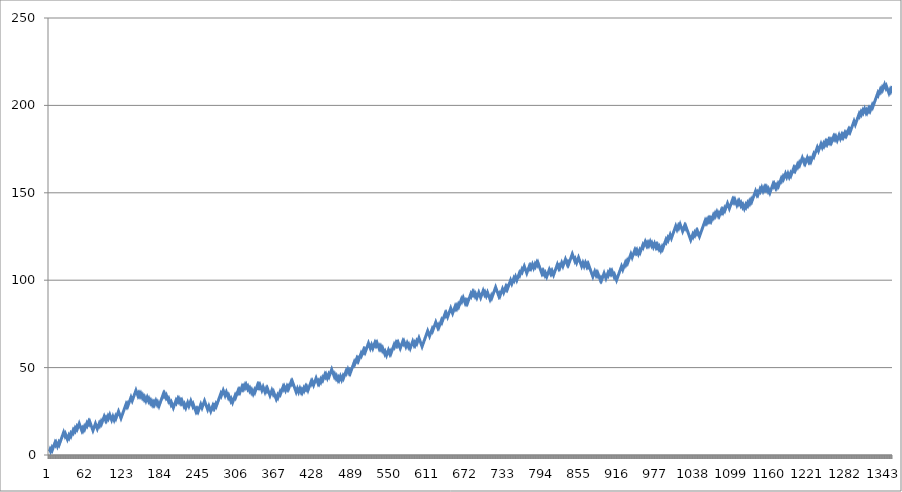
| Category | Series 0 |
|---|---|
| 0 | 2 |
| 1 | 3 |
| 2 | 2 |
| 3 | 3 |
| 4 | 4 |
| 5 | 3 |
| 6 | 4 |
| 7 | 5 |
| 8 | 6 |
| 9 | 7 |
| 10 | 6 |
| 11 | 7 |
| 12 | 6 |
| 13 | 5 |
| 14 | 6 |
| 15 | 7 |
| 16 | 6 |
| 17 | 7 |
| 18 | 8 |
| 19 | 9 |
| 20 | 10 |
| 21 | 11 |
| 22 | 12 |
| 23 | 13 |
| 24 | 12 |
| 25 | 11 |
| 26 | 12 |
| 27 | 11 |
| 28 | 10 |
| 29 | 9 |
| 30 | 10 |
| 31 | 11 |
| 32 | 10 |
| 33 | 11 |
| 34 | 12 |
| 35 | 11 |
| 36 | 12 |
| 37 | 13 |
| 38 | 14 |
| 39 | 13 |
| 40 | 14 |
| 41 | 15 |
| 42 | 14 |
| 43 | 15 |
| 44 | 16 |
| 45 | 15 |
| 46 | 16 |
| 47 | 17 |
| 48 | 18 |
| 49 | 17 |
| 50 | 16 |
| 51 | 15 |
| 52 | 14 |
| 53 | 15 |
| 54 | 14 |
| 55 | 15 |
| 56 | 16 |
| 57 | 15 |
| 58 | 16 |
| 59 | 17 |
| 60 | 18 |
| 61 | 17 |
| 62 | 18 |
| 63 | 19 |
| 64 | 18 |
| 65 | 19 |
| 66 | 18 |
| 67 | 17 |
| 68 | 16 |
| 69 | 15 |
| 70 | 14 |
| 71 | 15 |
| 72 | 16 |
| 73 | 17 |
| 74 | 18 |
| 75 | 17 |
| 76 | 16 |
| 77 | 15 |
| 78 | 16 |
| 79 | 17 |
| 80 | 18 |
| 81 | 17 |
| 82 | 18 |
| 83 | 19 |
| 84 | 18 |
| 85 | 19 |
| 86 | 20 |
| 87 | 21 |
| 88 | 22 |
| 89 | 21 |
| 90 | 20 |
| 91 | 21 |
| 92 | 20 |
| 93 | 21 |
| 94 | 22 |
| 95 | 21 |
| 96 | 22 |
| 97 | 23 |
| 98 | 22 |
| 99 | 21 |
| 100 | 20 |
| 101 | 21 |
| 102 | 22 |
| 103 | 21 |
| 104 | 20 |
| 105 | 21 |
| 106 | 22 |
| 107 | 21 |
| 108 | 22 |
| 109 | 23 |
| 110 | 24 |
| 111 | 25 |
| 112 | 24 |
| 113 | 23 |
| 114 | 22 |
| 115 | 21 |
| 116 | 22 |
| 117 | 23 |
| 118 | 24 |
| 119 | 25 |
| 120 | 26 |
| 121 | 27 |
| 122 | 28 |
| 123 | 29 |
| 124 | 28 |
| 125 | 29 |
| 126 | 28 |
| 127 | 29 |
| 128 | 30 |
| 129 | 31 |
| 130 | 32 |
| 131 | 33 |
| 132 | 32 |
| 133 | 31 |
| 134 | 32 |
| 135 | 33 |
| 136 | 34 |
| 137 | 35 |
| 138 | 36 |
| 139 | 37 |
| 140 | 36 |
| 141 | 35 |
| 142 | 34 |
| 143 | 35 |
| 144 | 34 |
| 145 | 35 |
| 146 | 34 |
| 147 | 35 |
| 148 | 34 |
| 149 | 33 |
| 150 | 34 |
| 151 | 33 |
| 152 | 32 |
| 153 | 33 |
| 154 | 32 |
| 155 | 31 |
| 156 | 32 |
| 157 | 33 |
| 158 | 32 |
| 159 | 31 |
| 160 | 32 |
| 161 | 31 |
| 162 | 30 |
| 163 | 31 |
| 164 | 30 |
| 165 | 29 |
| 166 | 30 |
| 167 | 29 |
| 168 | 30 |
| 169 | 29 |
| 170 | 30 |
| 171 | 31 |
| 172 | 30 |
| 173 | 29 |
| 174 | 30 |
| 175 | 29 |
| 176 | 28 |
| 177 | 29 |
| 178 | 30 |
| 179 | 31 |
| 180 | 32 |
| 181 | 33 |
| 182 | 34 |
| 183 | 35 |
| 184 | 34 |
| 185 | 35 |
| 186 | 34 |
| 187 | 33 |
| 188 | 34 |
| 189 | 33 |
| 190 | 32 |
| 191 | 31 |
| 192 | 32 |
| 193 | 31 |
| 194 | 30 |
| 195 | 29 |
| 196 | 30 |
| 197 | 29 |
| 198 | 28 |
| 199 | 27 |
| 200 | 28 |
| 201 | 29 |
| 202 | 30 |
| 203 | 31 |
| 204 | 30 |
| 205 | 31 |
| 206 | 32 |
| 207 | 31 |
| 208 | 32 |
| 209 | 31 |
| 210 | 30 |
| 211 | 31 |
| 212 | 30 |
| 213 | 31 |
| 214 | 30 |
| 215 | 29 |
| 216 | 28 |
| 217 | 29 |
| 218 | 28 |
| 219 | 27 |
| 220 | 28 |
| 221 | 29 |
| 222 | 30 |
| 223 | 29 |
| 224 | 28 |
| 225 | 29 |
| 226 | 30 |
| 227 | 31 |
| 228 | 30 |
| 229 | 29 |
| 230 | 28 |
| 231 | 29 |
| 232 | 28 |
| 233 | 27 |
| 234 | 26 |
| 235 | 25 |
| 236 | 26 |
| 237 | 25 |
| 238 | 26 |
| 239 | 25 |
| 240 | 26 |
| 241 | 27 |
| 242 | 28 |
| 243 | 29 |
| 244 | 28 |
| 245 | 27 |
| 246 | 28 |
| 247 | 29 |
| 248 | 30 |
| 249 | 31 |
| 250 | 30 |
| 251 | 29 |
| 252 | 28 |
| 253 | 27 |
| 254 | 26 |
| 255 | 27 |
| 256 | 28 |
| 257 | 27 |
| 258 | 26 |
| 259 | 25 |
| 260 | 26 |
| 261 | 27 |
| 262 | 28 |
| 263 | 27 |
| 264 | 28 |
| 265 | 27 |
| 266 | 28 |
| 267 | 29 |
| 268 | 28 |
| 269 | 29 |
| 270 | 30 |
| 271 | 31 |
| 272 | 32 |
| 273 | 33 |
| 274 | 34 |
| 275 | 35 |
| 276 | 34 |
| 277 | 35 |
| 278 | 36 |
| 279 | 37 |
| 280 | 36 |
| 281 | 35 |
| 282 | 34 |
| 283 | 35 |
| 284 | 36 |
| 285 | 35 |
| 286 | 34 |
| 287 | 33 |
| 288 | 34 |
| 289 | 33 |
| 290 | 32 |
| 291 | 31 |
| 292 | 32 |
| 293 | 31 |
| 294 | 30 |
| 295 | 31 |
| 296 | 32 |
| 297 | 33 |
| 298 | 34 |
| 299 | 33 |
| 300 | 34 |
| 301 | 35 |
| 302 | 36 |
| 303 | 37 |
| 304 | 36 |
| 305 | 37 |
| 306 | 36 |
| 307 | 37 |
| 308 | 38 |
| 309 | 39 |
| 310 | 38 |
| 311 | 39 |
| 312 | 38 |
| 313 | 39 |
| 314 | 40 |
| 315 | 39 |
| 316 | 40 |
| 317 | 39 |
| 318 | 38 |
| 319 | 39 |
| 320 | 38 |
| 321 | 37 |
| 322 | 38 |
| 323 | 37 |
| 324 | 36 |
| 325 | 37 |
| 326 | 36 |
| 327 | 35 |
| 328 | 36 |
| 329 | 37 |
| 330 | 36 |
| 331 | 37 |
| 332 | 38 |
| 333 | 39 |
| 334 | 40 |
| 335 | 39 |
| 336 | 40 |
| 337 | 39 |
| 338 | 40 |
| 339 | 39 |
| 340 | 38 |
| 341 | 37 |
| 342 | 38 |
| 343 | 39 |
| 344 | 38 |
| 345 | 37 |
| 346 | 36 |
| 347 | 37 |
| 348 | 38 |
| 349 | 37 |
| 350 | 38 |
| 351 | 37 |
| 352 | 36 |
| 353 | 35 |
| 354 | 34 |
| 355 | 35 |
| 356 | 36 |
| 357 | 37 |
| 358 | 36 |
| 359 | 35 |
| 360 | 36 |
| 361 | 35 |
| 362 | 34 |
| 363 | 33 |
| 364 | 32 |
| 365 | 33 |
| 366 | 34 |
| 367 | 33 |
| 368 | 34 |
| 369 | 35 |
| 370 | 36 |
| 371 | 35 |
| 372 | 36 |
| 373 | 37 |
| 374 | 38 |
| 375 | 39 |
| 376 | 38 |
| 377 | 39 |
| 378 | 38 |
| 379 | 37 |
| 380 | 38 |
| 381 | 39 |
| 382 | 38 |
| 383 | 39 |
| 384 | 38 |
| 385 | 39 |
| 386 | 40 |
| 387 | 41 |
| 388 | 42 |
| 389 | 41 |
| 390 | 42 |
| 391 | 41 |
| 392 | 40 |
| 393 | 39 |
| 394 | 38 |
| 395 | 37 |
| 396 | 36 |
| 397 | 37 |
| 398 | 38 |
| 399 | 37 |
| 400 | 36 |
| 401 | 37 |
| 402 | 38 |
| 403 | 37 |
| 404 | 36 |
| 405 | 37 |
| 406 | 36 |
| 407 | 37 |
| 408 | 38 |
| 409 | 37 |
| 410 | 38 |
| 411 | 39 |
| 412 | 38 |
| 413 | 39 |
| 414 | 38 |
| 415 | 37 |
| 416 | 38 |
| 417 | 39 |
| 418 | 40 |
| 419 | 41 |
| 420 | 42 |
| 421 | 41 |
| 422 | 42 |
| 423 | 41 |
| 424 | 40 |
| 425 | 41 |
| 426 | 42 |
| 427 | 43 |
| 428 | 44 |
| 429 | 43 |
| 430 | 42 |
| 431 | 41 |
| 432 | 42 |
| 433 | 41 |
| 434 | 42 |
| 435 | 43 |
| 436 | 42 |
| 437 | 43 |
| 438 | 44 |
| 439 | 43 |
| 440 | 44 |
| 441 | 45 |
| 442 | 46 |
| 443 | 45 |
| 444 | 46 |
| 445 | 45 |
| 446 | 44 |
| 447 | 45 |
| 448 | 46 |
| 449 | 45 |
| 450 | 46 |
| 451 | 47 |
| 452 | 48 |
| 453 | 49 |
| 454 | 48 |
| 455 | 47 |
| 456 | 46 |
| 457 | 45 |
| 458 | 46 |
| 459 | 45 |
| 460 | 44 |
| 461 | 45 |
| 462 | 44 |
| 463 | 43 |
| 464 | 44 |
| 465 | 43 |
| 466 | 44 |
| 467 | 45 |
| 468 | 44 |
| 469 | 43 |
| 470 | 44 |
| 471 | 45 |
| 472 | 44 |
| 473 | 45 |
| 474 | 46 |
| 475 | 47 |
| 476 | 48 |
| 477 | 47 |
| 478 | 48 |
| 479 | 49 |
| 480 | 48 |
| 481 | 47 |
| 482 | 48 |
| 483 | 47 |
| 484 | 48 |
| 485 | 49 |
| 486 | 50 |
| 487 | 51 |
| 488 | 52 |
| 489 | 53 |
| 490 | 52 |
| 491 | 53 |
| 492 | 54 |
| 493 | 55 |
| 494 | 54 |
| 495 | 55 |
| 496 | 54 |
| 497 | 55 |
| 498 | 56 |
| 499 | 57 |
| 500 | 58 |
| 501 | 57 |
| 502 | 58 |
| 503 | 59 |
| 504 | 60 |
| 505 | 59 |
| 506 | 60 |
| 507 | 59 |
| 508 | 60 |
| 509 | 61 |
| 510 | 62 |
| 511 | 63 |
| 512 | 64 |
| 513 | 63 |
| 514 | 62 |
| 515 | 61 |
| 516 | 62 |
| 517 | 63 |
| 518 | 62 |
| 519 | 61 |
| 520 | 62 |
| 521 | 63 |
| 522 | 64 |
| 523 | 63 |
| 524 | 64 |
| 525 | 63 |
| 526 | 64 |
| 527 | 63 |
| 528 | 62 |
| 529 | 61 |
| 530 | 62 |
| 531 | 61 |
| 532 | 62 |
| 533 | 61 |
| 534 | 60 |
| 535 | 61 |
| 536 | 60 |
| 537 | 59 |
| 538 | 58 |
| 539 | 59 |
| 540 | 58 |
| 541 | 57 |
| 542 | 58 |
| 543 | 59 |
| 544 | 60 |
| 545 | 59 |
| 546 | 58 |
| 547 | 59 |
| 548 | 58 |
| 549 | 59 |
| 550 | 60 |
| 551 | 61 |
| 552 | 62 |
| 553 | 63 |
| 554 | 62 |
| 555 | 63 |
| 556 | 64 |
| 557 | 63 |
| 558 | 64 |
| 559 | 63 |
| 560 | 64 |
| 561 | 63 |
| 562 | 62 |
| 563 | 61 |
| 564 | 62 |
| 565 | 63 |
| 566 | 64 |
| 567 | 65 |
| 568 | 64 |
| 569 | 65 |
| 570 | 64 |
| 571 | 63 |
| 572 | 62 |
| 573 | 63 |
| 574 | 64 |
| 575 | 63 |
| 576 | 62 |
| 577 | 63 |
| 578 | 62 |
| 579 | 61 |
| 580 | 62 |
| 581 | 63 |
| 582 | 64 |
| 583 | 65 |
| 584 | 64 |
| 585 | 63 |
| 586 | 64 |
| 587 | 63 |
| 588 | 64 |
| 589 | 65 |
| 590 | 64 |
| 591 | 65 |
| 592 | 66 |
| 593 | 67 |
| 594 | 66 |
| 595 | 65 |
| 596 | 64 |
| 597 | 63 |
| 598 | 62 |
| 599 | 63 |
| 600 | 64 |
| 601 | 65 |
| 602 | 66 |
| 603 | 67 |
| 604 | 68 |
| 605 | 69 |
| 606 | 70 |
| 607 | 71 |
| 608 | 70 |
| 609 | 69 |
| 610 | 68 |
| 611 | 69 |
| 612 | 70 |
| 613 | 71 |
| 614 | 72 |
| 615 | 71 |
| 616 | 72 |
| 617 | 73 |
| 618 | 74 |
| 619 | 75 |
| 620 | 76 |
| 621 | 75 |
| 622 | 74 |
| 623 | 73 |
| 624 | 74 |
| 625 | 73 |
| 626 | 74 |
| 627 | 75 |
| 628 | 76 |
| 629 | 77 |
| 630 | 76 |
| 631 | 77 |
| 632 | 78 |
| 633 | 79 |
| 634 | 80 |
| 635 | 81 |
| 636 | 80 |
| 637 | 81 |
| 638 | 80 |
| 639 | 79 |
| 640 | 80 |
| 641 | 81 |
| 642 | 82 |
| 643 | 83 |
| 644 | 84 |
| 645 | 83 |
| 646 | 82 |
| 647 | 81 |
| 648 | 82 |
| 649 | 83 |
| 650 | 84 |
| 651 | 85 |
| 652 | 84 |
| 653 | 85 |
| 654 | 84 |
| 655 | 85 |
| 656 | 86 |
| 657 | 85 |
| 658 | 86 |
| 659 | 87 |
| 660 | 88 |
| 661 | 89 |
| 662 | 88 |
| 663 | 89 |
| 664 | 90 |
| 665 | 89 |
| 666 | 88 |
| 667 | 87 |
| 668 | 88 |
| 669 | 87 |
| 670 | 88 |
| 671 | 87 |
| 672 | 88 |
| 673 | 89 |
| 674 | 90 |
| 675 | 91 |
| 676 | 92 |
| 677 | 91 |
| 678 | 92 |
| 679 | 93 |
| 680 | 92 |
| 681 | 93 |
| 682 | 92 |
| 683 | 91 |
| 684 | 92 |
| 685 | 91 |
| 686 | 90 |
| 687 | 91 |
| 688 | 92 |
| 689 | 93 |
| 690 | 92 |
| 691 | 91 |
| 692 | 90 |
| 693 | 91 |
| 694 | 92 |
| 695 | 93 |
| 696 | 94 |
| 697 | 93 |
| 698 | 92 |
| 699 | 93 |
| 700 | 92 |
| 701 | 91 |
| 702 | 92 |
| 703 | 93 |
| 704 | 92 |
| 705 | 91 |
| 706 | 90 |
| 707 | 89 |
| 708 | 90 |
| 709 | 91 |
| 710 | 90 |
| 711 | 91 |
| 712 | 92 |
| 713 | 93 |
| 714 | 94 |
| 715 | 95 |
| 716 | 96 |
| 717 | 95 |
| 718 | 94 |
| 719 | 93 |
| 720 | 92 |
| 721 | 91 |
| 722 | 92 |
| 723 | 91 |
| 724 | 92 |
| 725 | 93 |
| 726 | 94 |
| 727 | 95 |
| 728 | 94 |
| 729 | 93 |
| 730 | 94 |
| 731 | 95 |
| 732 | 96 |
| 733 | 95 |
| 734 | 96 |
| 735 | 95 |
| 736 | 96 |
| 737 | 97 |
| 738 | 98 |
| 739 | 99 |
| 740 | 100 |
| 741 | 99 |
| 742 | 98 |
| 743 | 99 |
| 744 | 100 |
| 745 | 101 |
| 746 | 100 |
| 747 | 101 |
| 748 | 102 |
| 749 | 101 |
| 750 | 100 |
| 751 | 101 |
| 752 | 102 |
| 753 | 103 |
| 754 | 104 |
| 755 | 103 |
| 756 | 104 |
| 757 | 105 |
| 758 | 106 |
| 759 | 105 |
| 760 | 106 |
| 761 | 107 |
| 762 | 108 |
| 763 | 107 |
| 764 | 106 |
| 765 | 105 |
| 766 | 104 |
| 767 | 105 |
| 768 | 106 |
| 769 | 107 |
| 770 | 108 |
| 771 | 107 |
| 772 | 108 |
| 773 | 107 |
| 774 | 108 |
| 775 | 109 |
| 776 | 108 |
| 777 | 107 |
| 778 | 108 |
| 779 | 109 |
| 780 | 108 |
| 781 | 109 |
| 782 | 110 |
| 783 | 109 |
| 784 | 110 |
| 785 | 109 |
| 786 | 108 |
| 787 | 107 |
| 788 | 106 |
| 789 | 105 |
| 790 | 104 |
| 791 | 105 |
| 792 | 104 |
| 793 | 105 |
| 794 | 104 |
| 795 | 103 |
| 796 | 104 |
| 797 | 103 |
| 798 | 102 |
| 799 | 103 |
| 800 | 104 |
| 801 | 105 |
| 802 | 106 |
| 803 | 105 |
| 804 | 104 |
| 805 | 105 |
| 806 | 104 |
| 807 | 105 |
| 808 | 104 |
| 809 | 103 |
| 810 | 104 |
| 811 | 105 |
| 812 | 106 |
| 813 | 107 |
| 814 | 108 |
| 815 | 109 |
| 816 | 108 |
| 817 | 107 |
| 818 | 108 |
| 819 | 107 |
| 820 | 108 |
| 821 | 109 |
| 822 | 110 |
| 823 | 109 |
| 824 | 108 |
| 825 | 109 |
| 826 | 110 |
| 827 | 111 |
| 828 | 112 |
| 829 | 111 |
| 830 | 110 |
| 831 | 109 |
| 832 | 110 |
| 833 | 109 |
| 834 | 110 |
| 835 | 111 |
| 836 | 112 |
| 837 | 113 |
| 838 | 114 |
| 839 | 115 |
| 840 | 114 |
| 841 | 113 |
| 842 | 112 |
| 843 | 111 |
| 844 | 112 |
| 845 | 111 |
| 846 | 110 |
| 847 | 111 |
| 848 | 112 |
| 849 | 113 |
| 850 | 112 |
| 851 | 111 |
| 852 | 110 |
| 853 | 109 |
| 854 | 108 |
| 855 | 109 |
| 856 | 110 |
| 857 | 109 |
| 858 | 108 |
| 859 | 109 |
| 860 | 110 |
| 861 | 109 |
| 862 | 108 |
| 863 | 109 |
| 864 | 108 |
| 865 | 109 |
| 866 | 108 |
| 867 | 107 |
| 868 | 106 |
| 869 | 105 |
| 870 | 104 |
| 871 | 103 |
| 872 | 102 |
| 873 | 103 |
| 874 | 104 |
| 875 | 105 |
| 876 | 104 |
| 877 | 103 |
| 878 | 104 |
| 879 | 103 |
| 880 | 104 |
| 881 | 103 |
| 882 | 102 |
| 883 | 101 |
| 884 | 100 |
| 885 | 101 |
| 886 | 100 |
| 887 | 101 |
| 888 | 102 |
| 889 | 103 |
| 890 | 104 |
| 891 | 103 |
| 892 | 102 |
| 893 | 101 |
| 894 | 102 |
| 895 | 103 |
| 896 | 104 |
| 897 | 103 |
| 898 | 104 |
| 899 | 105 |
| 900 | 104 |
| 901 | 105 |
| 902 | 104 |
| 903 | 105 |
| 904 | 104 |
| 905 | 103 |
| 906 | 102 |
| 907 | 103 |
| 908 | 102 |
| 909 | 101 |
| 910 | 100 |
| 911 | 101 |
| 912 | 102 |
| 913 | 103 |
| 914 | 104 |
| 915 | 105 |
| 916 | 106 |
| 917 | 107 |
| 918 | 108 |
| 919 | 107 |
| 920 | 106 |
| 921 | 107 |
| 922 | 108 |
| 923 | 109 |
| 924 | 110 |
| 925 | 109 |
| 926 | 110 |
| 927 | 111 |
| 928 | 110 |
| 929 | 111 |
| 930 | 112 |
| 931 | 113 |
| 932 | 114 |
| 933 | 115 |
| 934 | 114 |
| 935 | 113 |
| 936 | 114 |
| 937 | 115 |
| 938 | 116 |
| 939 | 117 |
| 940 | 116 |
| 941 | 117 |
| 942 | 116 |
| 943 | 117 |
| 944 | 116 |
| 945 | 115 |
| 946 | 116 |
| 947 | 117 |
| 948 | 116 |
| 949 | 117 |
| 950 | 118 |
| 951 | 119 |
| 952 | 120 |
| 953 | 119 |
| 954 | 120 |
| 955 | 121 |
| 956 | 122 |
| 957 | 121 |
| 958 | 120 |
| 959 | 121 |
| 960 | 120 |
| 961 | 121 |
| 962 | 120 |
| 963 | 121 |
| 964 | 122 |
| 965 | 121 |
| 966 | 120 |
| 967 | 121 |
| 968 | 120 |
| 969 | 119 |
| 970 | 120 |
| 971 | 121 |
| 972 | 120 |
| 973 | 119 |
| 974 | 120 |
| 975 | 119 |
| 976 | 120 |
| 977 | 119 |
| 978 | 118 |
| 979 | 119 |
| 980 | 118 |
| 981 | 117 |
| 982 | 118 |
| 983 | 119 |
| 984 | 118 |
| 985 | 119 |
| 986 | 120 |
| 987 | 121 |
| 988 | 122 |
| 989 | 123 |
| 990 | 122 |
| 991 | 123 |
| 992 | 124 |
| 993 | 123 |
| 994 | 124 |
| 995 | 125 |
| 996 | 126 |
| 997 | 125 |
| 998 | 124 |
| 999 | 125 |
| 1000 | 126 |
| 1001 | 127 |
| 1002 | 128 |
| 1003 | 129 |
| 1004 | 130 |
| 1005 | 131 |
| 1006 | 130 |
| 1007 | 129 |
| 1008 | 130 |
| 1009 | 131 |
| 1010 | 130 |
| 1011 | 131 |
| 1012 | 132 |
| 1013 | 131 |
| 1014 | 130 |
| 1015 | 129 |
| 1016 | 128 |
| 1017 | 129 |
| 1018 | 130 |
| 1019 | 131 |
| 1020 | 130 |
| 1021 | 131 |
| 1022 | 130 |
| 1023 | 129 |
| 1024 | 128 |
| 1025 | 127 |
| 1026 | 126 |
| 1027 | 125 |
| 1028 | 124 |
| 1029 | 123 |
| 1030 | 124 |
| 1031 | 125 |
| 1032 | 126 |
| 1033 | 125 |
| 1034 | 126 |
| 1035 | 127 |
| 1036 | 126 |
| 1037 | 127 |
| 1038 | 128 |
| 1039 | 127 |
| 1040 | 128 |
| 1041 | 127 |
| 1042 | 126 |
| 1043 | 125 |
| 1044 | 126 |
| 1045 | 127 |
| 1046 | 128 |
| 1047 | 129 |
| 1048 | 130 |
| 1049 | 131 |
| 1050 | 132 |
| 1051 | 133 |
| 1052 | 134 |
| 1053 | 133 |
| 1054 | 134 |
| 1055 | 133 |
| 1056 | 134 |
| 1057 | 135 |
| 1058 | 134 |
| 1059 | 135 |
| 1060 | 134 |
| 1061 | 135 |
| 1062 | 134 |
| 1063 | 135 |
| 1064 | 136 |
| 1065 | 137 |
| 1066 | 136 |
| 1067 | 137 |
| 1068 | 138 |
| 1069 | 137 |
| 1070 | 138 |
| 1071 | 139 |
| 1072 | 138 |
| 1073 | 137 |
| 1074 | 138 |
| 1075 | 137 |
| 1076 | 138 |
| 1077 | 139 |
| 1078 | 140 |
| 1079 | 139 |
| 1080 | 140 |
| 1081 | 139 |
| 1082 | 140 |
| 1083 | 141 |
| 1084 | 140 |
| 1085 | 141 |
| 1086 | 142 |
| 1087 | 143 |
| 1088 | 144 |
| 1089 | 143 |
| 1090 | 142 |
| 1091 | 141 |
| 1092 | 142 |
| 1093 | 143 |
| 1094 | 144 |
| 1095 | 145 |
| 1096 | 146 |
| 1097 | 145 |
| 1098 | 146 |
| 1099 | 145 |
| 1100 | 146 |
| 1101 | 145 |
| 1102 | 144 |
| 1103 | 143 |
| 1104 | 144 |
| 1105 | 145 |
| 1106 | 144 |
| 1107 | 145 |
| 1108 | 144 |
| 1109 | 143 |
| 1110 | 144 |
| 1111 | 143 |
| 1112 | 142 |
| 1113 | 143 |
| 1114 | 142 |
| 1115 | 141 |
| 1116 | 142 |
| 1117 | 143 |
| 1118 | 142 |
| 1119 | 143 |
| 1120 | 144 |
| 1121 | 143 |
| 1122 | 144 |
| 1123 | 145 |
| 1124 | 144 |
| 1125 | 145 |
| 1126 | 146 |
| 1127 | 145 |
| 1128 | 146 |
| 1129 | 147 |
| 1130 | 148 |
| 1131 | 149 |
| 1132 | 150 |
| 1133 | 151 |
| 1134 | 150 |
| 1135 | 149 |
| 1136 | 150 |
| 1137 | 149 |
| 1138 | 150 |
| 1139 | 151 |
| 1140 | 152 |
| 1141 | 151 |
| 1142 | 152 |
| 1143 | 153 |
| 1144 | 152 |
| 1145 | 151 |
| 1146 | 152 |
| 1147 | 153 |
| 1148 | 152 |
| 1149 | 153 |
| 1150 | 152 |
| 1151 | 153 |
| 1152 | 152 |
| 1153 | 151 |
| 1154 | 152 |
| 1155 | 151 |
| 1156 | 150 |
| 1157 | 151 |
| 1158 | 152 |
| 1159 | 153 |
| 1160 | 154 |
| 1161 | 155 |
| 1162 | 154 |
| 1163 | 155 |
| 1164 | 154 |
| 1165 | 153 |
| 1166 | 154 |
| 1167 | 153 |
| 1168 | 154 |
| 1169 | 155 |
| 1170 | 154 |
| 1171 | 155 |
| 1172 | 156 |
| 1173 | 157 |
| 1174 | 158 |
| 1175 | 157 |
| 1176 | 158 |
| 1177 | 159 |
| 1178 | 158 |
| 1179 | 159 |
| 1180 | 160 |
| 1181 | 161 |
| 1182 | 160 |
| 1183 | 159 |
| 1184 | 160 |
| 1185 | 161 |
| 1186 | 160 |
| 1187 | 159 |
| 1188 | 160 |
| 1189 | 161 |
| 1190 | 160 |
| 1191 | 161 |
| 1192 | 162 |
| 1193 | 163 |
| 1194 | 164 |
| 1195 | 163 |
| 1196 | 164 |
| 1197 | 163 |
| 1198 | 164 |
| 1199 | 165 |
| 1200 | 166 |
| 1201 | 165 |
| 1202 | 166 |
| 1203 | 167 |
| 1204 | 166 |
| 1205 | 167 |
| 1206 | 168 |
| 1207 | 169 |
| 1208 | 170 |
| 1209 | 169 |
| 1210 | 168 |
| 1211 | 167 |
| 1212 | 168 |
| 1213 | 167 |
| 1214 | 168 |
| 1215 | 169 |
| 1216 | 170 |
| 1217 | 169 |
| 1218 | 168 |
| 1219 | 169 |
| 1220 | 168 |
| 1221 | 169 |
| 1222 | 168 |
| 1223 | 169 |
| 1224 | 170 |
| 1225 | 171 |
| 1226 | 172 |
| 1227 | 171 |
| 1228 | 172 |
| 1229 | 173 |
| 1230 | 174 |
| 1231 | 175 |
| 1232 | 176 |
| 1233 | 175 |
| 1234 | 174 |
| 1235 | 175 |
| 1236 | 176 |
| 1237 | 177 |
| 1238 | 178 |
| 1239 | 177 |
| 1240 | 176 |
| 1241 | 177 |
| 1242 | 178 |
| 1243 | 177 |
| 1244 | 178 |
| 1245 | 179 |
| 1246 | 178 |
| 1247 | 179 |
| 1248 | 178 |
| 1249 | 179 |
| 1250 | 180 |
| 1251 | 179 |
| 1252 | 180 |
| 1253 | 179 |
| 1254 | 180 |
| 1255 | 179 |
| 1256 | 180 |
| 1257 | 181 |
| 1258 | 182 |
| 1259 | 181 |
| 1260 | 182 |
| 1261 | 181 |
| 1262 | 182 |
| 1263 | 181 |
| 1264 | 180 |
| 1265 | 181 |
| 1266 | 182 |
| 1267 | 183 |
| 1268 | 182 |
| 1269 | 181 |
| 1270 | 182 |
| 1271 | 183 |
| 1272 | 182 |
| 1273 | 183 |
| 1274 | 182 |
| 1275 | 183 |
| 1276 | 184 |
| 1277 | 183 |
| 1278 | 184 |
| 1279 | 183 |
| 1280 | 184 |
| 1281 | 185 |
| 1282 | 186 |
| 1283 | 185 |
| 1284 | 186 |
| 1285 | 185 |
| 1286 | 186 |
| 1287 | 187 |
| 1288 | 188 |
| 1289 | 189 |
| 1290 | 190 |
| 1291 | 191 |
| 1292 | 190 |
| 1293 | 189 |
| 1294 | 190 |
| 1295 | 191 |
| 1296 | 192 |
| 1297 | 193 |
| 1298 | 194 |
| 1299 | 195 |
| 1300 | 194 |
| 1301 | 195 |
| 1302 | 196 |
| 1303 | 195 |
| 1304 | 196 |
| 1305 | 197 |
| 1306 | 196 |
| 1307 | 197 |
| 1308 | 198 |
| 1309 | 197 |
| 1310 | 196 |
| 1311 | 197 |
| 1312 | 196 |
| 1313 | 197 |
| 1314 | 198 |
| 1315 | 197 |
| 1316 | 198 |
| 1317 | 197 |
| 1318 | 198 |
| 1319 | 199 |
| 1320 | 200 |
| 1321 | 199 |
| 1322 | 200 |
| 1323 | 201 |
| 1324 | 202 |
| 1325 | 203 |
| 1326 | 204 |
| 1327 | 205 |
| 1328 | 206 |
| 1329 | 207 |
| 1330 | 206 |
| 1331 | 207 |
| 1332 | 208 |
| 1333 | 209 |
| 1334 | 208 |
| 1335 | 209 |
| 1336 | 210 |
| 1337 | 209 |
| 1338 | 210 |
| 1339 | 211 |
| 1340 | 212 |
| 1341 | 211 |
| 1342 | 210 |
| 1343 | 211 |
| 1344 | 210 |
| 1345 | 209 |
| 1346 | 208 |
| 1347 | 207 |
| 1348 | 208 |
| 1349 | 209 |
| 1350 | 208 |
| 1351 | 209 |
| 1352 | 210 |
| 1353 | 211 |